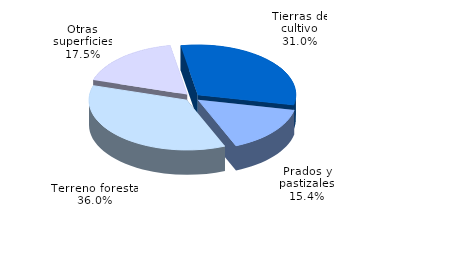
| Category | Series 0 |
|---|---|
| Tierras de cultivo | 156.693 |
| Prados y pastizales | 77.887 |
| Terreno forestal | 181.936 |
| Otras superficies | 88.346 |